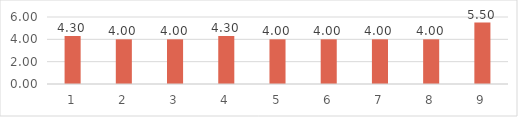
| Category | Series 0 |
|---|---|
| 0 | 4.3 |
| 1 | 4 |
| 2 | 4 |
| 3 | 4.3 |
| 4 | 4 |
| 5 | 4 |
| 6 | 4 |
| 7 | 4 |
| 8 | 5.5 |